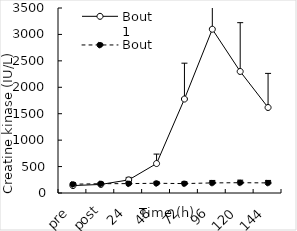
| Category | Bout 1 | Bout 2 |
|---|---|---|
| pre | 140.625 | 166.125 |
| post | 161.75 | 176 |
| 24 | 248 | 177.625 |
| 48 | 557.375 | 184.125 |
| 72 | 1777.625 | 178.125 |
| 96 | 3098.375 | 190.875 |
| 120 | 2299.375 | 194.75 |
| 144 | 1617.625 | 191 |